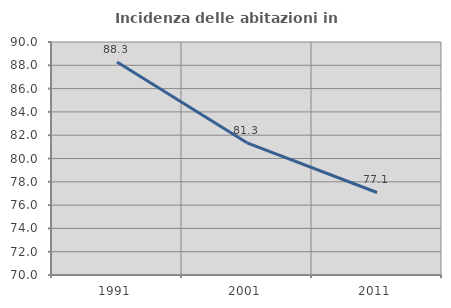
| Category | Incidenza delle abitazioni in proprietà  |
|---|---|
| 1991.0 | 88.288 |
| 2001.0 | 81.343 |
| 2011.0 | 77.083 |